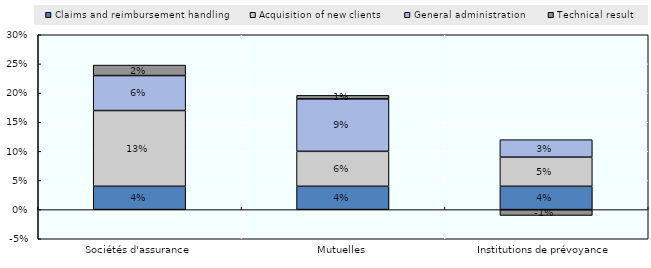
| Category | Claims and reimbursement handling | Acquisition of new clients | General administration | Technical result |
|---|---|---|---|---|
| Sociétés d'assurance | 0.04 | 0.13 | 0.06 | 0.018 |
| Mutuelles | 0.04 | 0.06 | 0.09 | 0.006 |
| Institutions de prévoyance | 0.04 | 0.05 | 0.03 | -0.01 |